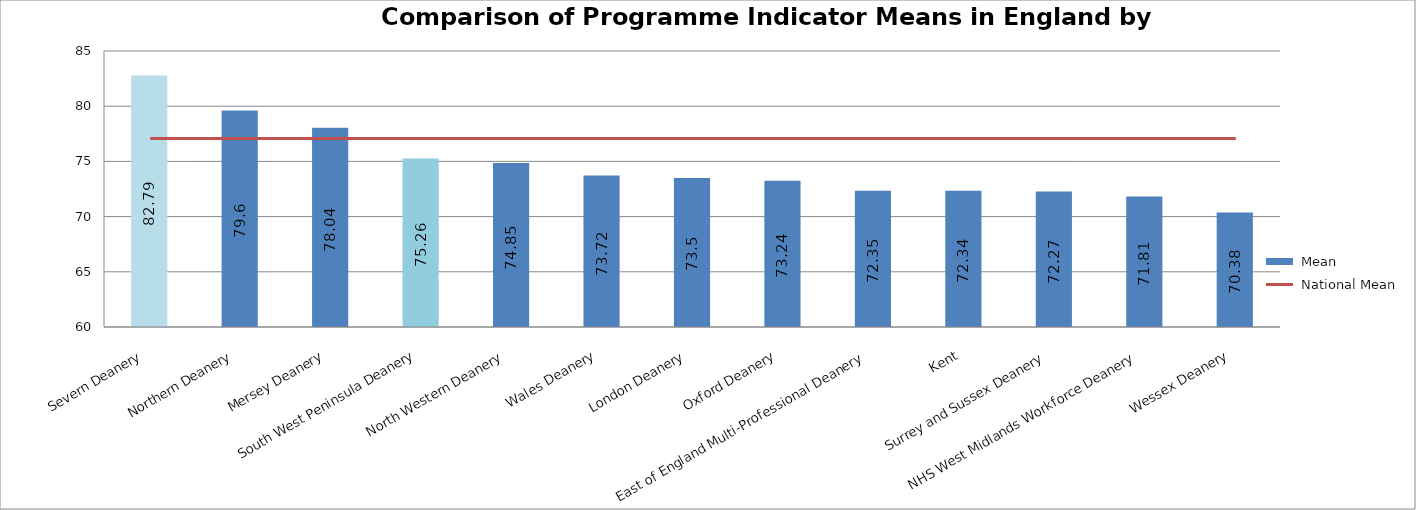
| Category |  Mean |
|---|---|
| Severn Deanery | 82.79 |
| Northern Deanery | 79.6 |
| Mersey Deanery | 78.04 |
| South West Peninsula Deanery | 75.26 |
| North Western Deanery | 74.85 |
| Wales Deanery | 73.72 |
| London Deanery | 73.5 |
| Oxford Deanery | 73.24 |
| East of England Multi-Professional Deanery | 72.35 |
| Kent, Surrey and Sussex Deanery | 72.34 |
| NHS West Midlands Workforce Deanery | 72.27 |
| Wessex Deanery | 71.81 |
| East Midlands Healthcare Workforce Deanery | 70.38 |